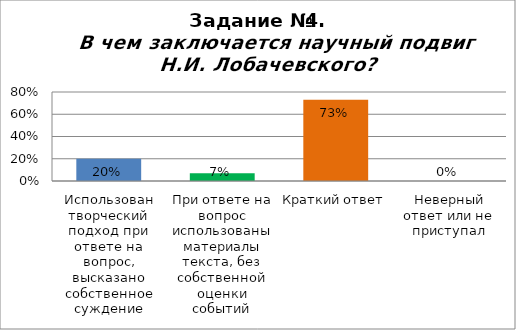
| Category | Series 0 |
|---|---|
| Использован творческий подход при ответе на вопрос, высказано собственное суждение | 0.2 |
| При ответе на вопрос использованы материалы текста, без собственной оценки событий | 0.07 |
| Краткий ответ | 0.73 |
| Неверный ответ или не приступал | 0 |